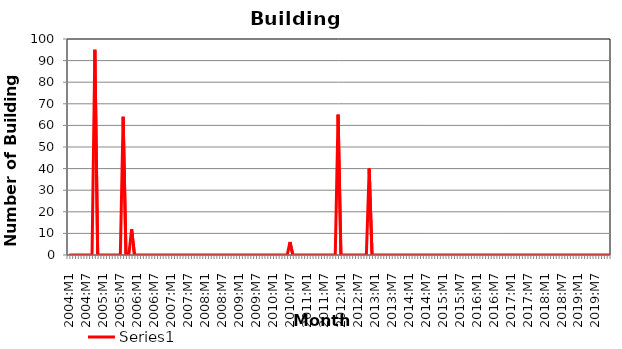
| Category | Series 0 |
|---|---|
| 2004:M1 | 0 |
| 2004:M2 | 0 |
| 2004:M3 | 0 |
| 2004:M4 | 0 |
| 2004:M5 | 0 |
| 2004:M6 | 0 |
| 2004:M7 | 0 |
| 2004:M8 | 0 |
| 2004:M9 | 0 |
| 2004:M10 | 95 |
| 2004:M11 | 0 |
| 2004:M12 | 0 |
| 2005:M1 | 0 |
| 2005:M2 | 0 |
| 2005:M3 | 0 |
| 2005:M4 | 0 |
| 2005:M5 | 0 |
| 2005:M6 | 0 |
| 2005:M7 | 0 |
| 2005:M8 | 64 |
| 2005:M9 | 0 |
| 2005:M10 | 0 |
| 2005:M11 | 12 |
| 2005:M12 | 0 |
| 2006:M1 | 0 |
| 2006:M2 | 0 |
| 2006:M3 | 0 |
| 2006:M4 | 0 |
| 2006:M5 | 0 |
| 2006:M6 | 0 |
| 2006:M7 | 0 |
| 2006:M8 | 0 |
| 2006:M9 | 0 |
| 2006:M10 | 0 |
| 2006:M11 | 0 |
| 2006:M12 | 0 |
| 2007:M1 | 0 |
| 2007:M2 | 0 |
| 2007:M3 | 0 |
| 2007:M4 | 0 |
| 2007:M5 | 0 |
| 2007:M6 | 0 |
| 2007:M7 | 0 |
| 2007:M8 | 0 |
| 2007:M9 | 0 |
| 2007:M10 | 0 |
| 2007:M11 | 0 |
| 2007:M12 | 0 |
| 2008:M1 | 0 |
| 2008:M2 | 0 |
| 2008:M3 | 0 |
| 2008:M4 | 0 |
| 2008:M5 | 0 |
| 2008:M6 | 0 |
| 2008:M7 | 0 |
| 2008:M8 | 0 |
| 2008:M9 | 0 |
| 2008:M10 | 0 |
| 2008:M11 | 0 |
| 2008:M12 | 0 |
| 2009:M1 | 0 |
| 2009:M2 | 0 |
| 2009:M3 | 0 |
| 2009:M4 | 0 |
| 2009:M5 | 0 |
| 2009:M6 | 0 |
| 2009:M7 | 0 |
| 2009:M8 | 0 |
| 2009:M9 | 0 |
| 2009:M10 | 0 |
| 2009:M11 | 0 |
| 2009:M12 | 0 |
| 2010:M1 | 0 |
| 2010:M2 | 0 |
| 2010:M3 | 0 |
| 2010:M4 | 0 |
| 2010:M5 | 0 |
| 2010:M6 | 0 |
| 2010:M7 | 6 |
| 2010:M8 | 0 |
| 2010:M9 | 0 |
| 2010:M10 | 0 |
| 2010:M11 | 0 |
| 2010:M12 | 0 |
| 2011:M1 | 0 |
| 2011:M2 | 0 |
| 2011:M3 | 0 |
| 2011:M4 | 0 |
| 2011:M5 | 0 |
| 2011:M6 | 0 |
| 2011:M7 | 0 |
| 2011:M8 | 0 |
| 2011:M9 | 0 |
| 2011:M10 | 0 |
| 2011:M11 | 0 |
| 2011:M12 | 65 |
| 2012:M1 | 0 |
| 2012:M2 | 0 |
| 2012:M3 | 0 |
| 2012:M4 | 0 |
| 2012:M5 | 0 |
| 2012:M6 | 0 |
| 2012:M7 | 0 |
| 2012:M8 | 0 |
| 2012:M9 | 0 |
| 2012:M10 | 0 |
| 2012:M11 | 40 |
| 2012:M12 | 0 |
| 2013:M1 | 0 |
| 2013:M2 | 0 |
| 2013:M3 | 0 |
| 2013:M4 | 0 |
| 2013:M5 | 0 |
| 2013:M6 | 0 |
| 2013:M7 | 0 |
| 2013:M8 | 0 |
| 2013:M9 | 0 |
| 2013:M10 | 0 |
| 2013:M11 | 0 |
| 2013:M12 | 0 |
| 2014:M1 | 0 |
| 2014:M2 | 0 |
| 2014:M3 | 0 |
| 2014:M4 | 0 |
| 2014:M5 | 0 |
| 2014:M6 | 0 |
| 2014:M7 | 0 |
| 2014:M8 | 0 |
| 2014:M9 | 0 |
| 2014:M10 | 0 |
| 2014:M11 | 0 |
| 2014:M12 | 0 |
| 2015:M1 | 0 |
| 2015:M2 | 0 |
| 2015:M3 | 0 |
| 2015:M4 | 0 |
| 2015:M5 | 0 |
| 2015:M6 | 0 |
| 2015:M7 | 0 |
| 2015:M8 | 0 |
| 2015:M9 | 0 |
| 2015:M10 | 0 |
| 2015:M11 | 0 |
| 2015:M12 | 0 |
| 2016:M1 | 0 |
| 2016:M2 | 0 |
| 2016:M3 | 0 |
| 2016:M4 | 0 |
| 2016:M5 | 0 |
| 2016:M6 | 0 |
| 2016:M7 | 0 |
| 2016:M8 | 0 |
| 2016:M9 | 0 |
| 2016:M10 | 0 |
| 2016:M11 | 0 |
| 2016:M12 | 0 |
| 2017:M1 | 0 |
| 2017:M2 | 0 |
| 2017:M3 | 0 |
| 2017:M4 | 0 |
| 2017:M5 | 0 |
| 2017:M6 | 0 |
| 2017:M7 | 0 |
| 2017:M8 | 0 |
| 2017:M9 | 0 |
| 2017:M10 | 0 |
| 2017:M11 | 0 |
| 2017:M12 | 0 |
| 2018:M1 | 0 |
| 2018:M2 | 0 |
| 2018:M3 | 0 |
| 2018:M4 | 0 |
| 2018:M5 | 0 |
| 2018:M6 | 0 |
| 2018:M7 | 0 |
| 2018:M8 | 0 |
| 2018:M9 | 0 |
| 2018:M10 | 0 |
| 2018:M11 | 0 |
| 2018:M12 | 0 |
| 2019:M1 | 0 |
| 2019:M2 | 0 |
| 2019:M3 | 0 |
| 2019:M4 | 0 |
| 2019:M5 | 0 |
| 2019:M6 | 0 |
| 2019:M7 | 0 |
| 2019:M8 | 0 |
| 2019:M9 | 0 |
| 2019:M10 | 0 |
| 2019:M11 | 0 |
| 2019:M12 | 0 |